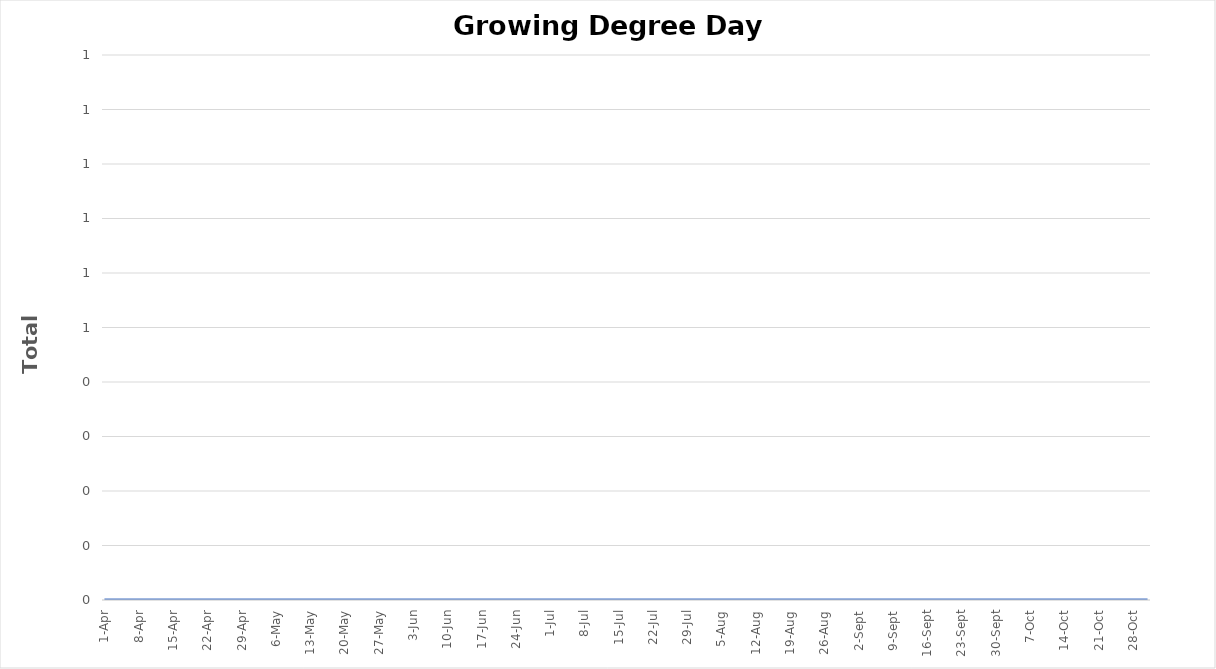
| Category | Sum GDD |
|---|---|
| 2023-04-01 | 0 |
| 2023-04-02 | 0 |
| 2023-04-03 | 0 |
| 2023-04-04 | 0 |
| 2023-04-05 | 0 |
| 2023-04-06 | 0 |
| 2023-04-07 | 0 |
| 2023-04-08 | 0 |
| 2023-04-09 | 0 |
| 2023-04-10 | 0 |
| 2023-04-11 | 0 |
| 2023-04-12 | 0 |
| 2023-04-13 | 0 |
| 2023-04-14 | 0 |
| 2023-04-15 | 0 |
| 2023-04-16 | 0 |
| 2023-04-17 | 0 |
| 2023-04-18 | 0 |
| 2023-04-19 | 0 |
| 2023-04-20 | 0 |
| 2023-04-21 | 0 |
| 2023-04-22 | 0 |
| 2023-04-23 | 0 |
| 2023-04-24 | 0 |
| 2023-04-25 | 0 |
| 2023-04-26 | 0 |
| 2023-04-27 | 0 |
| 2023-04-28 | 0 |
| 2023-04-29 | 0 |
| 2023-04-30 | 0 |
| 2023-05-01 | 0 |
| 2023-05-02 | 0 |
| 2023-05-03 | 0 |
| 2023-05-04 | 0 |
| 2023-05-05 | 0 |
| 2023-05-06 | 0 |
| 2023-05-07 | 0 |
| 2023-05-08 | 0 |
| 2023-05-09 | 0 |
| 2023-05-10 | 0 |
| 2023-05-11 | 0 |
| 2023-05-12 | 0 |
| 2023-05-13 | 0 |
| 2023-05-14 | 0 |
| 2023-05-15 | 0 |
| 2023-05-16 | 0 |
| 2023-05-17 | 0 |
| 2023-05-18 | 0 |
| 2023-05-19 | 0 |
| 2023-05-20 | 0 |
| 2023-05-21 | 0 |
| 2023-05-22 | 0 |
| 2023-05-23 | 0 |
| 2023-05-24 | 0 |
| 2023-05-25 | 0 |
| 2023-05-26 | 0 |
| 2023-05-27 | 0 |
| 2023-05-28 | 0 |
| 2023-05-29 | 0 |
| 2023-05-30 | 0 |
| 2023-05-31 | 0 |
| 2023-06-01 | 0 |
| 2023-06-02 | 0 |
| 2023-06-03 | 0 |
| 2023-06-04 | 0 |
| 2023-06-05 | 0 |
| 2023-06-06 | 0 |
| 2023-06-07 | 0 |
| 2023-06-08 | 0 |
| 2023-06-09 | 0 |
| 2023-06-10 | 0 |
| 2023-06-11 | 0 |
| 2023-06-12 | 0 |
| 2023-06-13 | 0 |
| 2023-06-14 | 0 |
| 2023-06-15 | 0 |
| 2023-06-16 | 0 |
| 2023-06-17 | 0 |
| 2023-06-18 | 0 |
| 2023-06-19 | 0 |
| 2023-06-20 | 0 |
| 2023-06-21 | 0 |
| 2023-06-22 | 0 |
| 2023-06-23 | 0 |
| 2023-06-24 | 0 |
| 2023-06-25 | 0 |
| 2023-06-26 | 0 |
| 2023-06-27 | 0 |
| 2023-06-28 | 0 |
| 2023-06-29 | 0 |
| 2023-06-30 | 0 |
| 2023-07-01 | 0 |
| 2023-07-02 | 0 |
| 2023-07-03 | 0 |
| 2023-07-04 | 0 |
| 2023-07-05 | 0 |
| 2023-07-06 | 0 |
| 2023-07-07 | 0 |
| 2023-07-08 | 0 |
| 2023-07-09 | 0 |
| 2023-07-10 | 0 |
| 2023-07-11 | 0 |
| 2023-07-12 | 0 |
| 2023-07-13 | 0 |
| 2023-07-14 | 0 |
| 2023-07-15 | 0 |
| 2023-07-16 | 0 |
| 2023-07-17 | 0 |
| 2023-07-18 | 0 |
| 2023-07-19 | 0 |
| 2023-07-20 | 0 |
| 2023-07-21 | 0 |
| 2023-07-22 | 0 |
| 2023-07-23 | 0 |
| 2023-07-24 | 0 |
| 2023-07-25 | 0 |
| 2023-07-26 | 0 |
| 2023-07-27 | 0 |
| 2023-07-28 | 0 |
| 2023-07-29 | 0 |
| 2023-07-30 | 0 |
| 2023-07-31 | 0 |
| 2023-08-01 | 0 |
| 2023-08-02 | 0 |
| 2023-08-03 | 0 |
| 2023-08-04 | 0 |
| 2023-08-05 | 0 |
| 2023-08-06 | 0 |
| 2023-08-07 | 0 |
| 2023-08-08 | 0 |
| 2023-08-09 | 0 |
| 2023-08-10 | 0 |
| 2023-08-11 | 0 |
| 2023-08-12 | 0 |
| 2023-08-13 | 0 |
| 2023-08-14 | 0 |
| 2023-08-15 | 0 |
| 2023-08-16 | 0 |
| 2023-08-17 | 0 |
| 2023-08-18 | 0 |
| 2023-08-19 | 0 |
| 2023-08-20 | 0 |
| 2023-08-21 | 0 |
| 2023-08-22 | 0 |
| 2023-08-23 | 0 |
| 2023-08-24 | 0 |
| 2023-08-25 | 0 |
| 2023-08-26 | 0 |
| 2023-08-27 | 0 |
| 2023-08-28 | 0 |
| 2023-08-29 | 0 |
| 2023-08-30 | 0 |
| 2023-08-31 | 0 |
| 2023-09-01 | 0 |
| 2023-09-02 | 0 |
| 2023-09-03 | 0 |
| 2023-09-04 | 0 |
| 2023-09-05 | 0 |
| 2023-09-06 | 0 |
| 2023-09-07 | 0 |
| 2023-09-08 | 0 |
| 2023-09-09 | 0 |
| 2023-09-10 | 0 |
| 2023-09-11 | 0 |
| 2023-09-12 | 0 |
| 2023-09-13 | 0 |
| 2023-09-14 | 0 |
| 2023-09-15 | 0 |
| 2023-09-16 | 0 |
| 2023-09-17 | 0 |
| 2023-09-18 | 0 |
| 2023-09-19 | 0 |
| 2023-09-20 | 0 |
| 2023-09-21 | 0 |
| 2023-09-22 | 0 |
| 2023-09-23 | 0 |
| 2023-09-24 | 0 |
| 2023-09-25 | 0 |
| 2023-09-26 | 0 |
| 2023-09-27 | 0 |
| 2023-09-28 | 0 |
| 2023-09-29 | 0 |
| 2023-09-30 | 0 |
| 2023-10-01 | 0 |
| 2023-10-02 | 0 |
| 2023-10-03 | 0 |
| 2023-10-04 | 0 |
| 2023-10-05 | 0 |
| 2023-10-06 | 0 |
| 2023-10-07 | 0 |
| 2023-10-08 | 0 |
| 2023-10-09 | 0 |
| 2023-10-10 | 0 |
| 2023-10-11 | 0 |
| 2023-10-12 | 0 |
| 2023-10-13 | 0 |
| 2023-10-14 | 0 |
| 2023-10-15 | 0 |
| 2023-10-16 | 0 |
| 2023-10-17 | 0 |
| 2023-10-18 | 0 |
| 2023-10-19 | 0 |
| 2023-10-20 | 0 |
| 2023-10-21 | 0 |
| 2023-10-22 | 0 |
| 2023-10-23 | 0 |
| 2023-10-24 | 0 |
| 2023-10-25 | 0 |
| 2023-10-26 | 0 |
| 2023-10-27 | 0 |
| 2023-10-28 | 0 |
| 2023-10-29 | 0 |
| 2023-10-30 | 0 |
| 2023-10-31 | 0 |